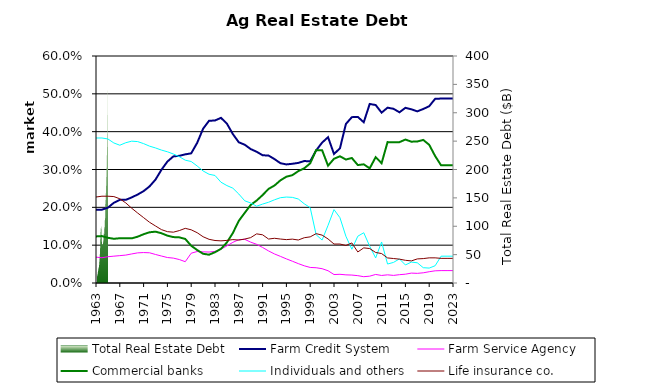
| Category | Total Real Estate Debt |
|---|---|
| 1960.0 | 11309593 |
| 1961.0 | 12318392 |
| 1962.0 | 13488450 |
| 1963.0 | 14981360 |
| 1964.0 | 16850311 |
| 1965.0 | 18915889 |
| 1966.0 | 20696043 |
| 1967.0 | 22613532 |
| 1968.0 | 24729257 |
| 1969.0 | 26415866 |
| 1970.0 | 27238348 |
| 1971.0 | 28826497 |
| 1972.0 | 31379625 |
| 1973.0 | 35188298 |
| 1974.0 | 39563003 |
| 1975.0 | 43750962 |
| 1976.0 | 48484701 |
| 1977.0 | 55834463 |
| 1978.0 | 63424623 |
| 1979.0 | 75778090 |
| 1980.0 | 85272367 |
| 1981.0 | 93905270 |
| 1982.0 | 96769083 |
| 1983.0 | 98071338 |
| 1984.0 | 101393312 |
| 1985.0 | 94089977 |
| 1986.0 | 84087662 |
| 1987.0 | 75809859 |
| 1988.0 | 70829423 |
| 1989.0 | 68761420 |
| 1990.0 | 67632973 |
| 1991.0 | 67449880 |
| 1992.0 | 67879337 |
| 1993.0 | 68432731 |
| 1994.0 | 69911852 |
| 1995.0 | 71722937 |
| 1996.0 | 74422235 |
| 1997.0 | 78513555 |
| 1998.0 | 83100263 |
| 1999.0 | 87206087 |
| 2000.0 | 84723763 |
| 2001.0 | 88541011 |
| 2002.0 | 98118184 |
| 2003.0 | 97396385 |
| 2004.0 | 104161951 |
| 2005.0 | 113886209 |
| 2006.0 | 113365478 |
| 2007.0 | 131710955 |
| 2008.0 | 147901855 |
| 2009.0 | 145979853 |
| 2010.0 | 154065225 |
| 2011.0 | 167190768 |
| 2012.0 | 173368636 |
| 2013.0 | 185160530 |
| 2014.0 | 196780224 |
| 2015.0 | 208769246 |
| 2016.0 | 225980433 |
| 2017.0 | 236243057 |
| 2018.0 | 245773538 |
| 2019.0 | 267943655 |
| 2020.0 | 288645325 |
| 2021.0 | 324257298 |
| 2022.0 | 349067861 |
| 2023.0 | 375860118 |